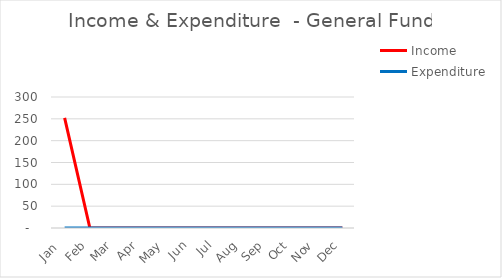
| Category | Series 0 | Income | Expenditure |
|---|---|---|---|
| Jan  |  | 252 | 0 |
| Feb |  | 0 | 0 |
| Mar |  | 0 | 0 |
| Apr |  | 0 | 0 |
| May |  | 0 | 0 |
| Jun |  | 0 | 0 |
| Jul |  | 0 | 0 |
| Aug |  | 0 | 0 |
| Sep |  | 0 | 0 |
| Oct |  | 0 | 0 |
| Nov |  | 0 | 0 |
| Dec |  | 0 | 0 |